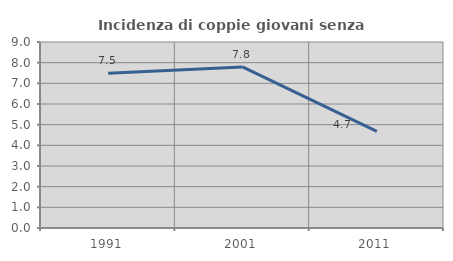
| Category | Incidenza di coppie giovani senza figli |
|---|---|
| 1991.0 | 7.483 |
| 2001.0 | 7.796 |
| 2011.0 | 4.675 |